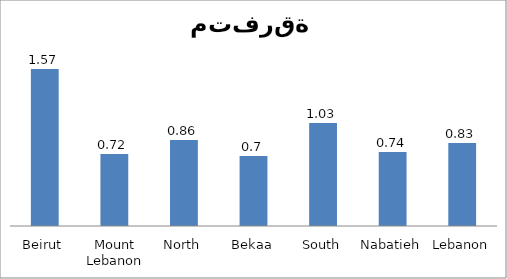
| Category | Series 0 |
|---|---|
| Beirut | 1.57 |
| Mount Lebanon | 0.72 |
| North | 0.86 |
| Bekaa | 0.7 |
| South | 1.03 |
| Nabatieh | 0.74 |
| Lebanon | 0.83 |